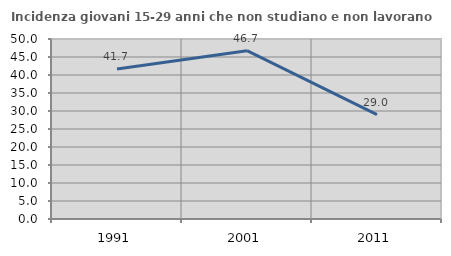
| Category | Incidenza giovani 15-29 anni che non studiano e non lavorano  |
|---|---|
| 1991.0 | 41.654 |
| 2001.0 | 46.749 |
| 2011.0 | 28.97 |